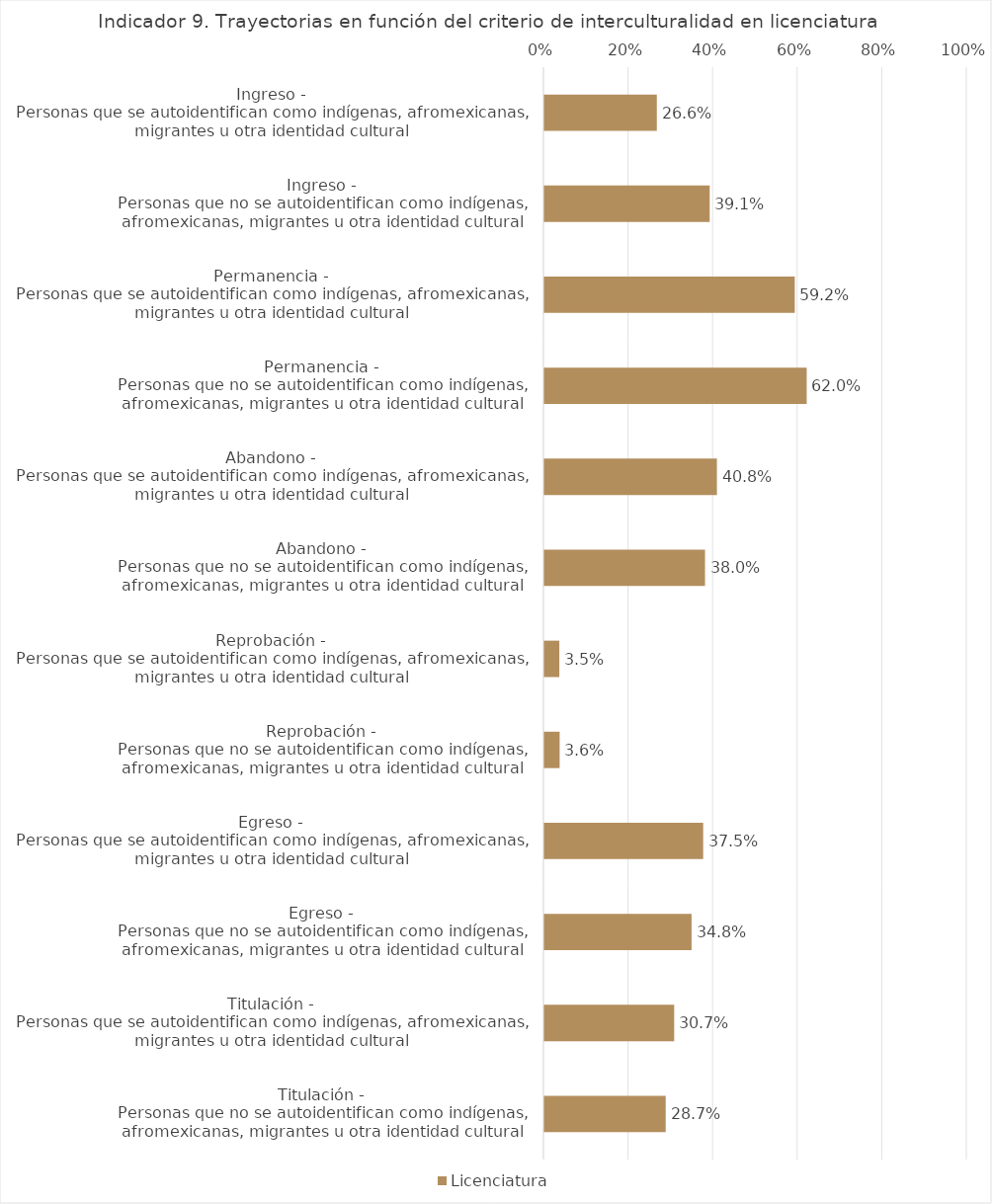
| Category | Licenciatura |
|---|---|
| Ingreso - 
Personas que se autoidentifican como indígenas, afromexicanas, migrantes u otra identidad cultural | 0.266 |
| Ingreso - 
Personas que no se autoidentifican como indígenas, afromexicanas, migrantes u otra identidad cultural | 0.391 |
| Permanencia - 
Personas que se autoidentifican como indígenas, afromexicanas, migrantes u otra identidad cultural | 0.592 |
| Permanencia - 
Personas que no se autoidentifican como indígenas, afromexicanas, migrantes u otra identidad cultural | 0.62 |
| Abandono - 
Personas que se autoidentifican como indígenas, afromexicanas, migrantes u otra identidad cultural | 0.408 |
| Abandono - 
Personas que no se autoidentifican como indígenas, afromexicanas, migrantes u otra identidad cultural | 0.38 |
| Reprobación - 
Personas que se autoidentifican como indígenas, afromexicanas, migrantes u otra identidad cultural | 0.035 |
| Reprobación - 
Personas que no se autoidentifican como indígenas, afromexicanas, migrantes u otra identidad cultural | 0.036 |
| Egreso - 
Personas que se autoidentifican como indígenas, afromexicanas, migrantes u otra identidad cultural | 0.375 |
| Egreso - 
Personas que no se autoidentifican como indígenas, afromexicanas, migrantes u otra identidad cultural | 0.348 |
| Titulación - 
Personas que se autoidentifican como indígenas, afromexicanas, migrantes u otra identidad cultural | 0.307 |
| Titulación - 
Personas que no se autoidentifican como indígenas, afromexicanas, migrantes u otra identidad cultural | 0.287 |